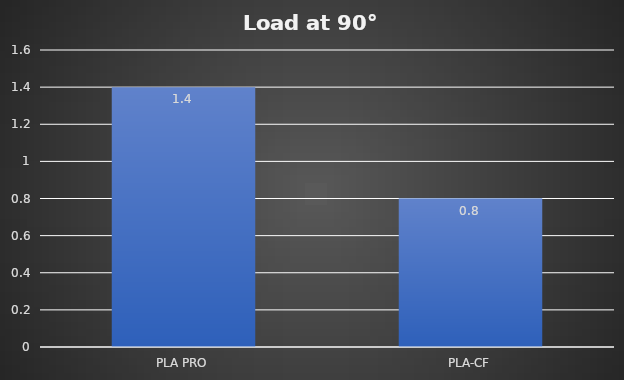
| Category | Load at 90° |
|---|---|
| PLA PRO | 1.4 |
| PLA-CF | 0.8 |